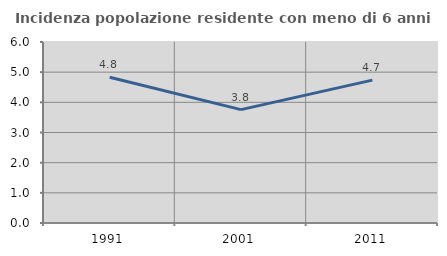
| Category | Incidenza popolazione residente con meno di 6 anni |
|---|---|
| 1991.0 | 4.833 |
| 2001.0 | 3.759 |
| 2011.0 | 4.736 |